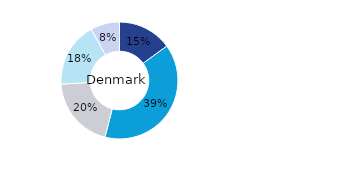
| Category | Denmark |
|---|---|
| Office | 0.15 |
| Residential | 0.39 |
| Retail | 0.2 |
| Logistics* | 0.18 |
| Other | 0.08 |